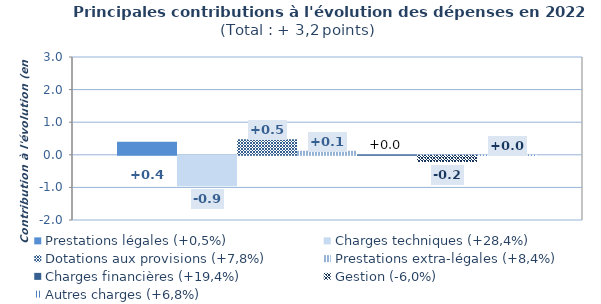
| Category | Prestations légales (+0,5%) | Charges techniques (+28,4%) | Dotations aux provisions (+7,8%) | Prestations extra-légales (+8,4%) | Charges financières (+19,4%) | Gestion (-6,0%) | Autres charges (+6,8%) |
|---|---|---|---|---|---|---|---|
| Contri croiss | 0.401 | -0.937 | 0.48 | 0.124 | 0.009 | -0.191 | 0.004 |